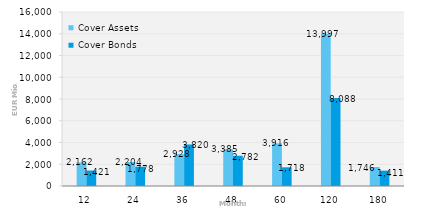
| Category | Cover Assets | Cover Bonds |
|---|---|---|
| 12.0 | 2162.408 | 1420.526 |
| 24.0 | 2203.522 | 1777.5 |
| 36.0 | 2928.432 | 3820 |
| 48.0 | 3385.074 | 2781.5 |
| 60.0 | 3915.954 | 1718 |
| 120.0 | 13996.792 | 8088 |
| 180.0 | 1745.625 | 1411 |